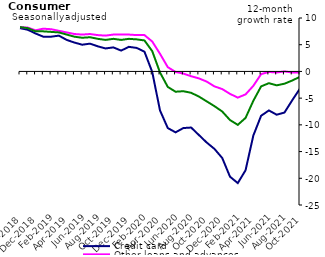
| Category | Credit card | Other loans and advances | Total |
|---|---|---|---|
| Oct-2018 | 8.1 | 8.3 | 8.3 |
| Nov-2018 | 7.8 | 8.2 | 8.1 |
| Dec-2018 | 7.1 | 7.7 | 7.5 |
| Jan-2019 | 6.5 | 8 | 7.5 |
| Feb-2019 | 6.5 | 7.9 | 7.4 |
| Mar-2019 | 6.7 | 7.6 | 7.3 |
| Apr-2019 | 5.9 | 7.3 | 6.9 |
| May-2019 | 5.4 | 7 | 6.5 |
| Jun-2019 | 5 | 6.9 | 6.3 |
| Jul-2019 | 5.2 | 7 | 6.4 |
| Aug-2019 | 4.7 | 6.8 | 6.1 |
| Sep-2019 | 4.3 | 6.7 | 5.9 |
| Oct-2019 | 4.5 | 6.9 | 6.1 |
| Nov-2019 | 3.9 | 6.9 | 5.9 |
| Dec-2019 | 4.6 | 6.9 | 6.1 |
| Jan-2020 | 4.4 | 6.8 | 6 |
| Feb-2020 | 3.7 | 6.8 | 5.8 |
| Mar-2020 | -0.1 | 5.6 | 3.8 |
| Apr-2020 | -7.3 | 3.3 | -0.2 |
| May-2020 | -10.6 | 0.8 | -2.9 |
| Jun-2020 | -11.4 | -0.1 | -3.8 |
| Jul-2020 | -10.6 | -0.4 | -3.7 |
| Aug-2020 | -10.5 | -0.9 | -4 |
| Sep-2020 | -11.9 | -1.3 | -4.7 |
| Oct-2020 | -13.3 | -1.9 | -5.6 |
| Nov-2020 | -14.5 | -2.8 | -6.5 |
| Dec-2020 | -16.2 | -3.3 | -7.5 |
| Jan-2021 | -19.7 | -4.2 | -9.1 |
| Feb-2021 | -20.9 | -4.9 | -10 |
| Mar-2021 | -18.5 | -4.3 | -8.7 |
| Apr-2021 | -12 | -2.7 | -5.5 |
| May-2021 | -8.3 | -0.5 | -2.8 |
| Jun-2021 | -7.3 | -0.1 | -2.2 |
| Jul-2021 | -8.1 | -0.2 | -2.6 |
| Aug-2021 | -7.7 | 0 | -2.3 |
| Sep-2021 | -5.4 | -0.2 | -1.7 |
| Oct-2021 | -3.2 | -0.2 | -1 |